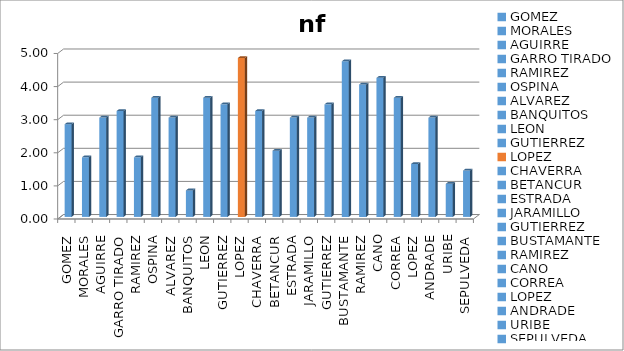
| Category | nf |
|---|---|
| GOMEZ | 2.8 |
| MORALES | 1.8 |
| AGUIRRE | 3 |
| GARRO TIRADO | 3.2 |
| RAMIREZ | 1.8 |
| OSPINA | 3.6 |
| ALVAREZ | 3 |
| BANQUITOS | 0.8 |
| LEON | 3.6 |
| GUTIERREZ | 3.4 |
| LOPEZ | 4.8 |
| CHAVERRA | 3.2 |
| BETANCUR | 2 |
| ESTRADA | 3 |
| JARAMILLO | 3 |
| GUTIERREZ | 3.4 |
| BUSTAMANTE | 4.7 |
| RAMIREZ | 4 |
| CANO | 4.2 |
| CORREA | 3.6 |
| LOPEZ | 1.6 |
| ANDRADE | 3 |
| URIBE | 1 |
| SEPULVEDA | 1.4 |